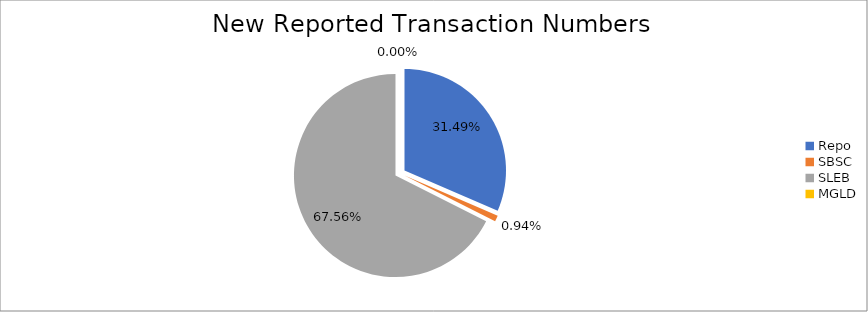
| Category | Series 0 |
|---|---|
| Repo | 309699 |
| SBSC | 9270 |
| SLEB | 664452 |
| MGLD | 18 |